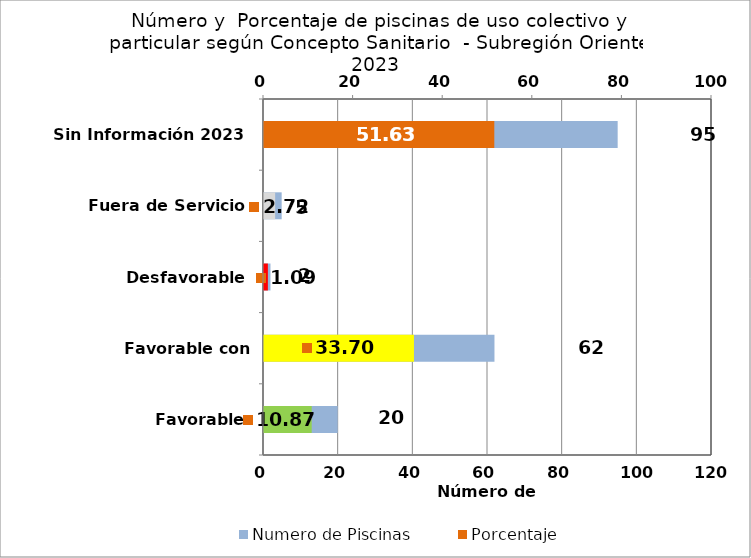
| Category | Numero de Piscinas |
|---|---|
| Favorable | 20 |
| Favorable con Requerimientos | 62 |
| Desfavorable | 2 |
| Fuera de Servicio | 5 |
| Sin Información 2023 | 95 |